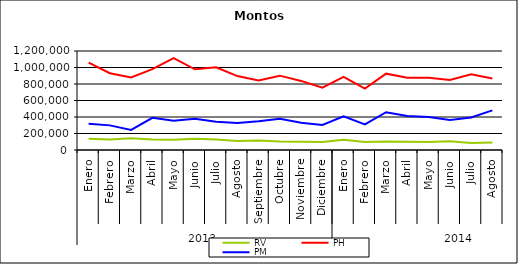
| Category | RV | PH | PM |
|---|---|---|---|
| 0 | 136808.804 | 1058774.967 | 316751.291 |
| 1 | 127193.421 | 930111.334 | 298480.292 |
| 2 | 142052.509 | 880100.908 | 242691.68 |
| 3 | 126637.277 | 980038.371 | 389833.89 |
| 4 | 123189.846 | 1112542.201 | 355777.139 |
| 5 | 135184.022 | 977877.296 | 379782.022 |
| 6 | 127790.361 | 1003315.643 | 342842.568 |
| 7 | 110532.346 | 895717.973 | 326616.455 |
| 8 | 114630.859 | 843607.598 | 348985.725 |
| 9 | 102262.08 | 901170.281 | 379642.157 |
| 10 | 99242.352 | 837424.505 | 330278.777 |
| 11 | 96243.301 | 754952.55 | 304473.582 |
| 12 | 124770.971 | 885857.327 | 408057.686 |
| 13 | 96987.292 | 744736.746 | 309218.036 |
| 14 | 103624.997 | 925209.281 | 458118.752 |
| 15 | 100007.683 | 874534.649 | 410841.727 |
| 16 | 96199.147 | 875356.86 | 399197.561 |
| 17 | 104965.63 | 848001.408 | 363776.247 |
| 18 | 85979.134 | 918529.646 | 394798.235 |
| 19 | 91006.222 | 867037.612 | 479726.319 |